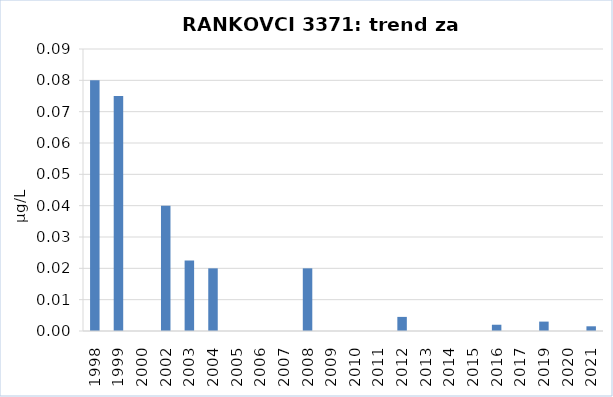
| Category | Vsota |
|---|---|
| 1998 | 0.08 |
| 1999 | 0.075 |
| 2000 | 0 |
| 2002 | 0.04 |
| 2003 | 0.022 |
| 2004 | 0.02 |
| 2005 | 0 |
| 2006 | 0 |
| 2007 | 0 |
| 2008 | 0.02 |
| 2009 | 0 |
| 2010 | 0 |
| 2011 | 0 |
| 2012 | 0.005 |
| 2013 | 0 |
| 2014 | 0 |
| 2015 | 0 |
| 2016 | 0.002 |
| 2017 | 0 |
| 2019 | 0.003 |
| 2020 | 0 |
| 2021 | 0.002 |